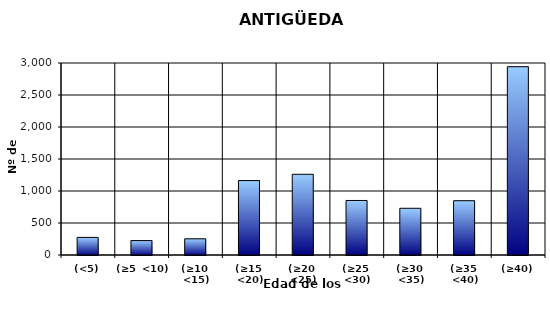
| Category | (<5) |
|---|---|
| (<5) | 275 |
| (≥5  <10) | 225 |
| (≥10  <15) | 253 |
| (≥15  <20) | 1163 |
| (≥20  <25) | 1261 |
| (≥25  <30) | 852 |
| (≥30  <35) | 730 |
| (≥35  <40) | 848 |
| (≥40) | 2942 |